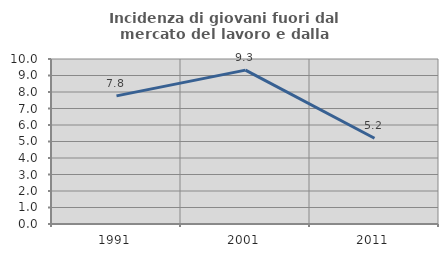
| Category | Incidenza di giovani fuori dal mercato del lavoro e dalla formazione  |
|---|---|
| 1991.0 | 7.765 |
| 2001.0 | 9.326 |
| 2011.0 | 5.199 |